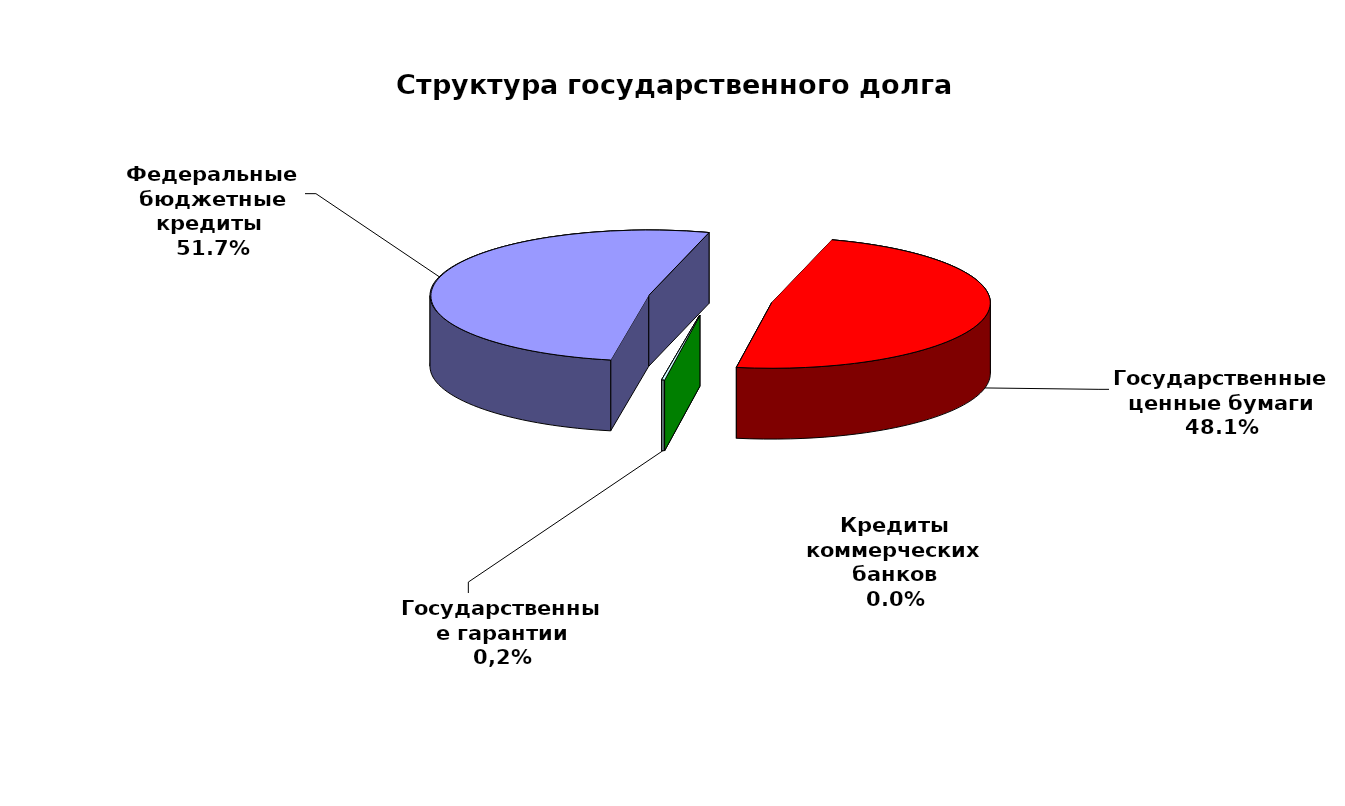
| Category | Series 0 |
|---|---|
| Федеральные бюджетные кредиты  | 37149676.663 |
| Государственные ценные бумаги | 34600000 |
| Кредиты коммерческих банков | 0 |
| Государственные гарантии | 141570.67 |